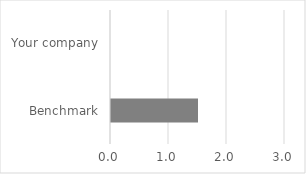
| Category | Understanding of supply chain risk |
|---|---|
| Benchmark | 1.5 |
| Your company | 0 |